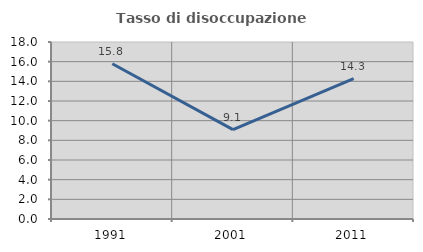
| Category | Tasso di disoccupazione giovanile  |
|---|---|
| 1991.0 | 15.789 |
| 2001.0 | 9.091 |
| 2011.0 | 14.286 |